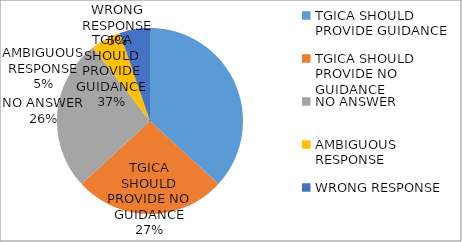
| Category | Series 0 |
|---|---|
| TGICA SHOULD PROVIDE GUIDANCE | 0.368 |
| TGICA SHOULD PROVIDE NO GUIDANCE | 0.263 |
| NO ANSWER | 0.263 |
| AMBIGUOUS RESPONSE | 0.053 |
| WRONG RESPONSE | 0.053 |